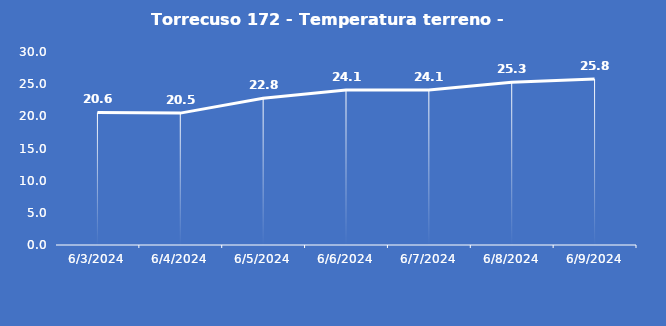
| Category | Torrecuso 172 - Temperatura terreno - Grezzo (°C) |
|---|---|
| 6/3/24 | 20.6 |
| 6/4/24 | 20.5 |
| 6/5/24 | 22.8 |
| 6/6/24 | 24.1 |
| 6/7/24 | 24.1 |
| 6/8/24 | 25.3 |
| 6/9/24 | 25.8 |